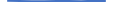
| Category | Series 0 |
|---|---|
| 0 | 23 |
| 1 | 20 |
| 2 | 15 |
| 3 | 14 |
| 4 | 19 |
| 5 | 20 |
| 6 | 16 |
| 7 | 24 |
| 8 | 18 |